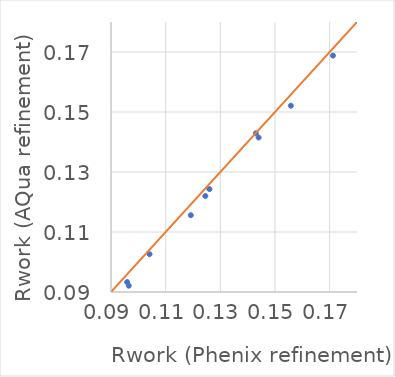
| Category | Series 0 |
|---|---|
| 0.1192 | 0.116 |
| 0.1558 | 0.152 |
| 0.144 | 0.142 |
| 0.1041 | 0.103 |
| 0.126 | 0.124 |
| 0.0965 | 0.092 |
| 0.1712 | 0.169 |
| 0.0959 | 0.093 |
| 0.143 | 0.143 |
| 0.1245 | 0.122 |